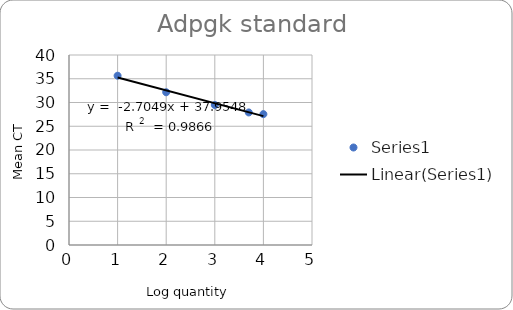
| Category | Series 0 |
|---|---|
| 4.0 | 27.551 |
| 3.698970004336019 | 27.906 |
| 3.0 | 29.468 |
| 2.0 | 32.158 |
| 1.0 | 35.637 |